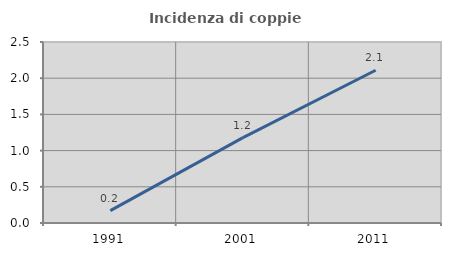
| Category | Incidenza di coppie miste |
|---|---|
| 1991.0 | 0.171 |
| 2001.0 | 1.178 |
| 2011.0 | 2.11 |